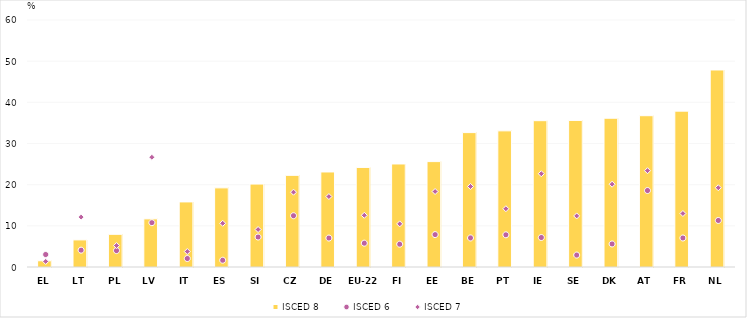
| Category | ISCED 8 |
|---|---|
| EL | 1.511 |
| LT | 6.584 |
| PL | 7.938 |
| LV | 11.696 |
| IT | 15.809 |
| ES | 19.223 |
| SI | 20.145 |
| CZ | 22.263 |
| DE | 23.088 |
| EU-22 | 24.186 |
| FI | 25.024 |
| EE | 25.603 |
| BE | 32.646 |
| PT | 33.074 |
| IE | 35.545 |
| SE | 35.603 |
| DK | 36.137 |
| AT | 36.75 |
| FR | 37.862 |
| NL | 47.859 |